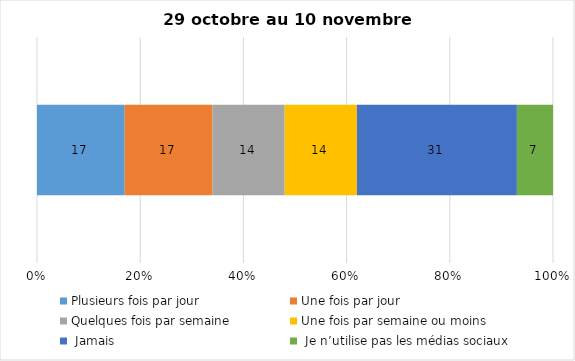
| Category | Plusieurs fois par jour | Une fois par jour | Quelques fois par semaine   | Une fois par semaine ou moins   |  Jamais   |  Je n’utilise pas les médias sociaux |
|---|---|---|---|---|---|---|
| 0 | 17 | 17 | 14 | 14 | 31 | 7 |